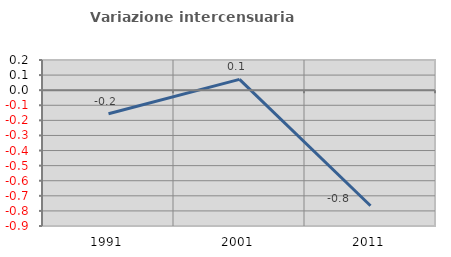
| Category | Variazione intercensuaria annua |
|---|---|
| 1991.0 | -0.156 |
| 2001.0 | 0.071 |
| 2011.0 | -0.766 |